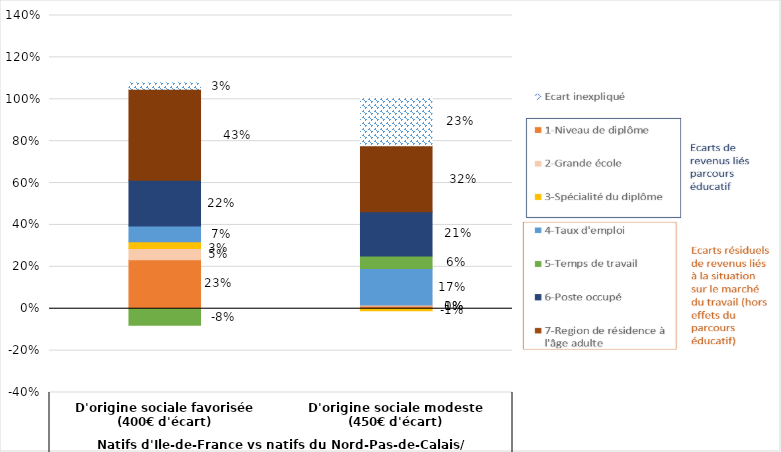
| Category | 1-Niveau de diplôme | 2-Grande école | 3-Spécialité du diplôme | 4-Taux d'emploi | 5-Temps de travail | 6-Poste occupé | 7-Region de résidence | Ecart inexpliqué |
|---|---|---|---|---|---|---|---|---|
| 0 | 0.233 | 0.054 | 0.033 | 0.074 | -0.079 | 0.219 | 0.434 | 0.031 |
| 1 | 0.013 | 0.005 | -0.01 | 0.174 | 0.06 | 0.211 | 0.315 | 0.232 |